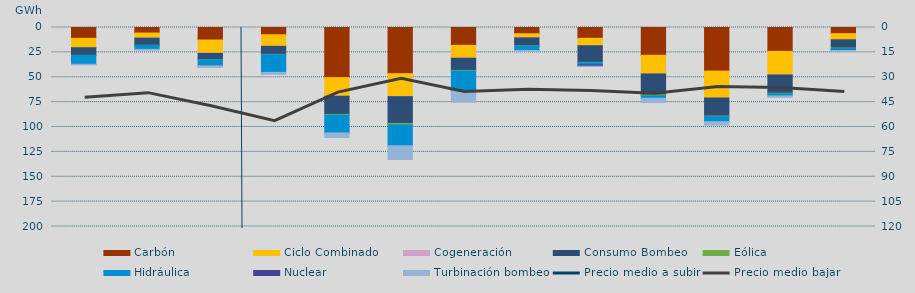
| Category | Carbón | Ciclo Combinado | Cogeneración | Consumo Bombeo | Eólica | Hidráulica | Nuclear | Turbinación bombeo |
|---|---|---|---|---|---|---|---|---|
| 0 | 10892.6 | 9459.3 | 19 | 7585 | 201.8 | 8745.3 | 0 | 691.6 |
| 1 | 5563.5 | 5060.2 | 113 | 7129.2 | 169.4 | 3964.2 | 0 | 709 |
| 2 | 12581.1 | 13203.9 | 233 | 6261.8 | 220.5 | 5846.4 | 125 | 1688.7 |
| 3 | 7306.9 | 11559.1 | 88 | 7999 | 402.8 | 17797.7 | 0 | 1941.3 |
| 4 | 50376 | 18600.8 | 92.8 | 18257.2 | 867.9 | 17793.5 | 0 | 4596.7 |
| 5 | 46429 | 22875.8 | 230 | 26858.5 | 1566 | 20878.9 | 0 | 13810.2 |
| 6 | 17956.2 | 12815.5 | 103.4 | 12162.2 | 688.3 | 19850.2 | 66 | 11430.1 |
| 7 | 6283.8 | 4145.3 | 18.9 | 7977.8 | 313 | 4389.8 | 0 | 935.6 |
| 8 | 10864.5 | 7378.2 | 88.1 | 16621.4 | 464.4 | 2067.3 | 1381.8 | 160.4 |
| 9 | 27924.7 | 18737.8 | 26.5 | 21039.7 | 1083.3 | 2318.1 | 0 | 4314 |
| 10 | 43819.1 | 26947.4 | 131.4 | 18038.2 | 700.3 | 5037 | 0 | 3400 |
| 11 | 23995.8 | 23603.4 | 120.4 | 18312.9 | 630.7 | 2095.3 | 0 | 1288.4 |
| 12 | 6238.1 | 6107.2 | 11.4 | 8233.1 | 466.1 | 1774.5 | 300.5 | 185 |